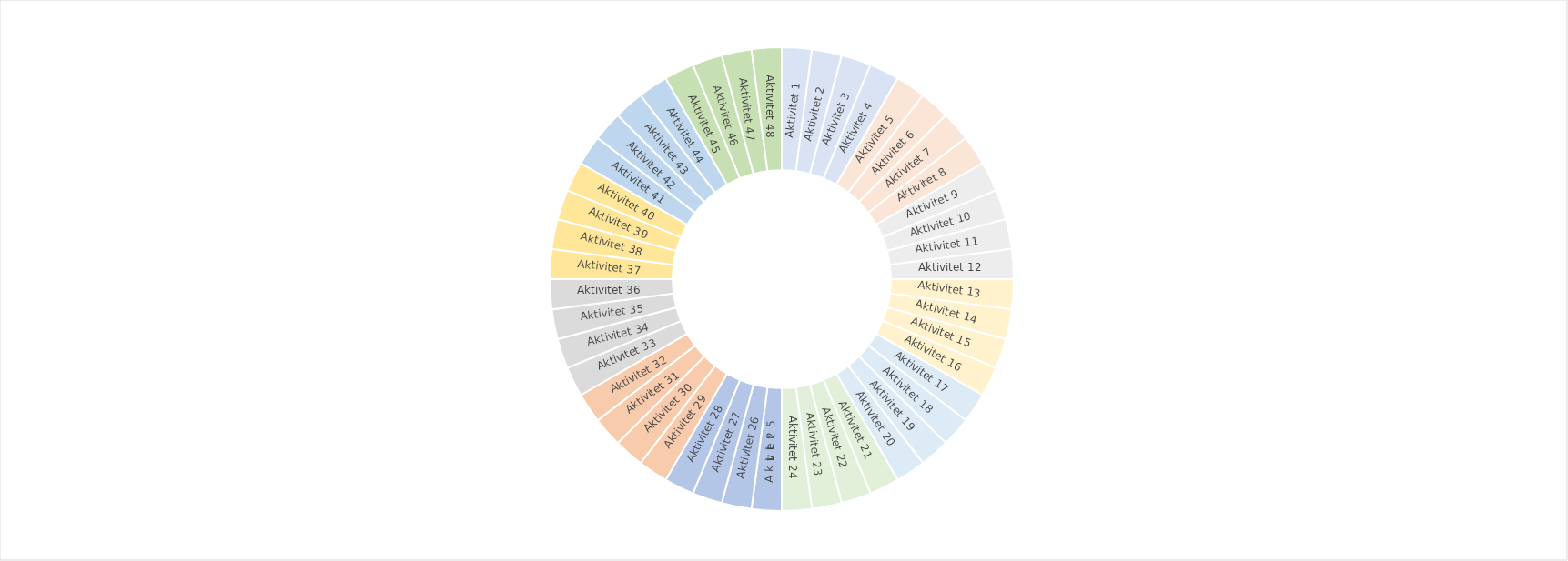
| Category | Series 0 |
|---|---|
| Aktivitet 1 | 1 |
| Aktivitet 2 | 1 |
| Aktivitet 3 | 1 |
| Aktivitet 4 | 1 |
| Aktivitet 5 | 1 |
| Aktivitet 6 | 1 |
| Aktivitet 7 | 1 |
| Aktivitet 8 | 1 |
| Aktivitet 9 | 1 |
| Aktivitet 10 | 1 |
| Aktivitet 11 | 1 |
| Aktivitet 12 | 1 |
| Aktivitet 13 | 1 |
| Aktivitet 14 | 1 |
| Aktivitet 15 | 1 |
| Aktivitet 16 | 1 |
| Aktivitet 17 | 1 |
| Aktivitet 18 | 1 |
| Aktivitet 19 | 1 |
| Aktivitet 20 | 1 |
| Aktivitet 21 | 1 |
| Aktivitet 22 | 1 |
| Aktivitet 23 | 1 |
| Aktivitet 24 | 1 |
| Aktivitet 25 | 1 |
| Aktivitet 26 | 1 |
| Aktivitet 27 | 1 |
| Aktivitet 28 | 1 |
| Aktivitet 29 | 1 |
| Aktivitet 30 | 1 |
| Aktivitet 31 | 1 |
| Aktivitet 32 | 1 |
| Aktivitet 33 | 1 |
| Aktivitet 34 | 1 |
| Aktivitet 35 | 1 |
| Aktivitet 36 | 1 |
| Aktivitet 37 | 1 |
| Aktivitet 38 | 1 |
| Aktivitet 39 | 1 |
| Aktivitet 40 | 1 |
| Aktivitet 41 | 1 |
| Aktivitet 42 | 1 |
| Aktivitet 43 | 1 |
| Aktivitet 44 | 1 |
| Aktivitet 45 | 1 |
| Aktivitet 46 | 1 |
| Aktivitet 47 | 1 |
| Aktivitet 48 | 1 |